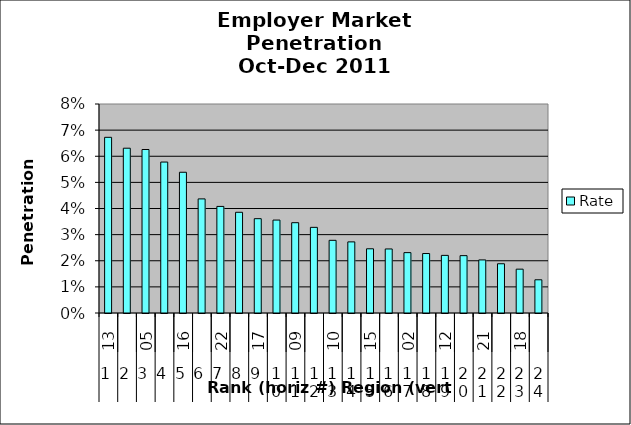
| Category | Rate |
|---|---|
| 0 | 0.067 |
| 1 | 0.063 |
| 2 | 0.063 |
| 3 | 0.058 |
| 4 | 0.054 |
| 5 | 0.044 |
| 6 | 0.041 |
| 7 | 0.039 |
| 8 | 0.036 |
| 9 | 0.036 |
| 10 | 0.035 |
| 11 | 0.033 |
| 12 | 0.028 |
| 13 | 0.027 |
| 14 | 0.025 |
| 15 | 0.025 |
| 16 | 0.023 |
| 17 | 0.023 |
| 18 | 0.022 |
| 19 | 0.022 |
| 20 | 0.02 |
| 21 | 0.019 |
| 22 | 0.017 |
| 23 | 0.013 |